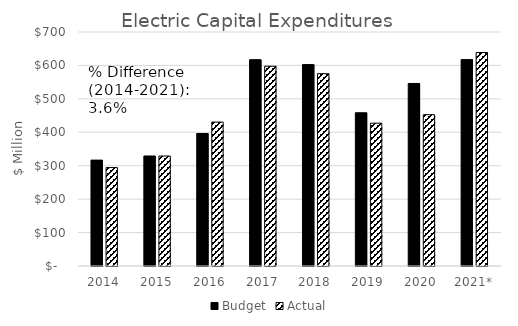
| Category | Budget | Actual |
|---|---|---|
| 2014 | 316.755 | 294.402 |
| 2015 | 329.153 | 328.941 |
| 2016 | 396.328 | 430.517 |
| 2017 | 617.187 | 597.544 |
| 2018 | 602.557 | 575.251 |
| 2019 | 458.437 | 427.228 |
| 2020 | 546.055 | 452.675 |
| 2021* | 617.419 | 638.741 |